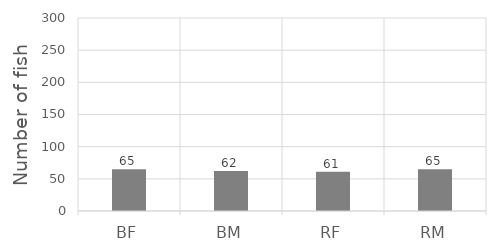
| Category | Series 0 |
|---|---|
| BF | 65 |
| BM | 62 |
| RF | 61 |
| RM | 65 |